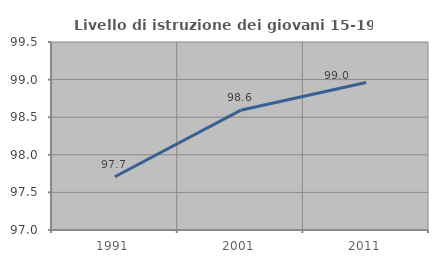
| Category | Livello di istruzione dei giovani 15-19 anni |
|---|---|
| 1991.0 | 97.708 |
| 2001.0 | 98.592 |
| 2011.0 | 98.962 |